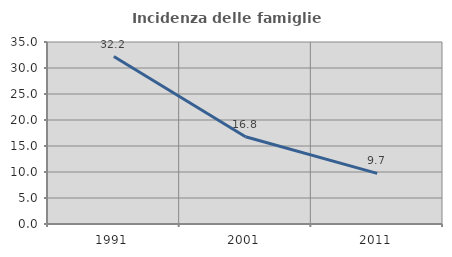
| Category | Incidenza delle famiglie numerose |
|---|---|
| 1991.0 | 32.198 |
| 2001.0 | 16.79 |
| 2011.0 | 9.74 |